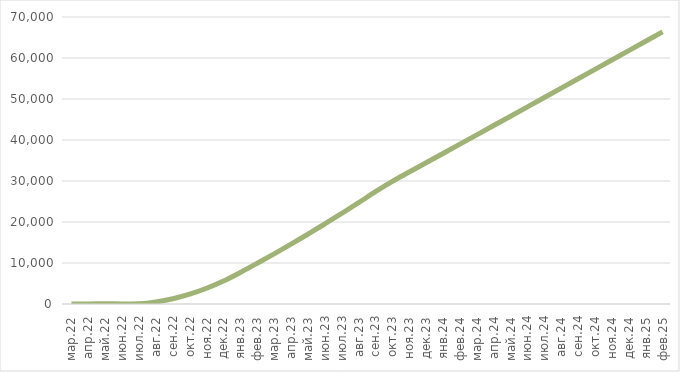
| Category | Дисконтированный поток нарастающим итогом |
|---|---|
| мар.22 | 0 |
| апр.22 | 0.464 |
| май.22 | 75.008 |
| июн.22 | 19.692 |
| июл.22 | 42.955 |
| авг.22 | 493.553 |
| сен.22 | 1278.326 |
| окт.22 | 2394.206 |
| ноя.22 | 3838.087 |
| дек.22 | 5606.886 |
| янв.23 | 7697.542 |
| фев.23 | 9926.688 |
| мар.23 | 12223.621 |
| апр.23 | 14587.705 |
| май.23 | 17018.265 |
| июн.23 | 19514.628 |
| июл.23 | 22076.129 |
| авг.23 | 24702.106 |
| сен.23 | 27391.901 |
| окт.23 | 29924.681 |
| ноя.23 | 32180.918 |
| дек.23 | 34448.198 |
| янв.24 | 36714.881 |
| фев.24 | 38983.902 |
| мар.24 | 41255.22 |
| апр.24 | 43528.766 |
| май.24 | 45804.469 |
| июн.24 | 48082.259 |
| июл.24 | 50362.068 |
| авг.24 | 52643.828 |
| сен.24 | 54927.47 |
| окт.24 | 57212.927 |
| ноя.24 | 59500.133 |
| дек.24 | 61789.022 |
| янв.25 | 64079.528 |
| фев.25 | 66371.586 |